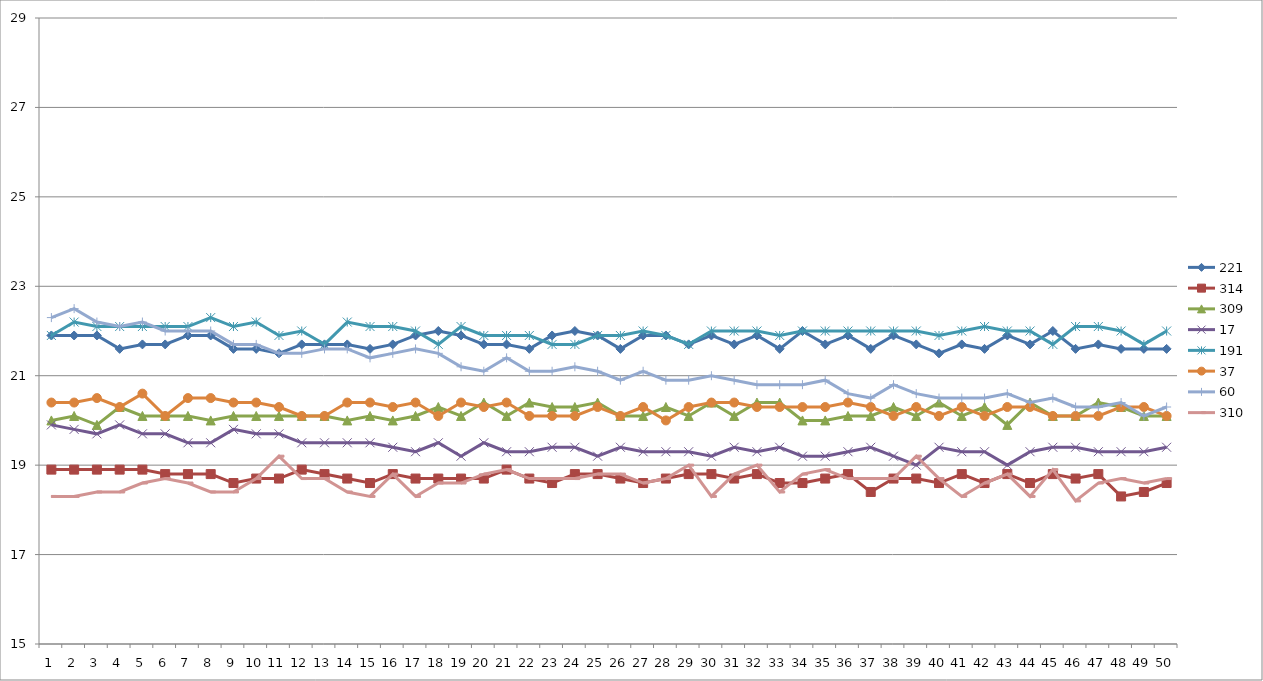
| Category | 221 | 314 | 309 | 17 | 191 | 37 | 60 | 310 |
|---|---|---|---|---|---|---|---|---|
| 0 | 21.9 | 18.9 | 20 | 19.9 | 21.9 | 20.4 | 22.3 | 18.3 |
| 1 | 21.9 | 18.9 | 20.1 | 19.8 | 22.2 | 20.4 | 22.5 | 18.3 |
| 2 | 21.9 | 18.9 | 19.9 | 19.7 | 22.1 | 20.5 | 22.2 | 18.4 |
| 3 | 21.6 | 18.9 | 20.3 | 19.9 | 22.1 | 20.3 | 22.1 | 18.4 |
| 4 | 21.7 | 18.9 | 20.1 | 19.7 | 22.1 | 20.6 | 22.2 | 18.6 |
| 5 | 21.7 | 18.8 | 20.1 | 19.7 | 22.1 | 20.1 | 22 | 18.7 |
| 6 | 21.9 | 18.8 | 20.1 | 19.5 | 22.1 | 20.5 | 22 | 18.6 |
| 7 | 21.9 | 18.8 | 20 | 19.5 | 22.3 | 20.5 | 22 | 18.4 |
| 8 | 21.6 | 18.6 | 20.1 | 19.8 | 22.1 | 20.4 | 21.7 | 18.4 |
| 9 | 21.6 | 18.7 | 20.1 | 19.7 | 22.2 | 20.4 | 21.7 | 18.7 |
| 10 | 21.5 | 18.7 | 20.1 | 19.7 | 21.9 | 20.3 | 21.5 | 19.2 |
| 11 | 21.7 | 18.9 | 20.1 | 19.5 | 22 | 20.1 | 21.5 | 18.7 |
| 12 | 21.7 | 18.8 | 20.1 | 19.5 | 21.7 | 20.1 | 21.6 | 18.7 |
| 13 | 21.7 | 18.7 | 20 | 19.5 | 22.2 | 20.4 | 21.6 | 18.4 |
| 14 | 21.6 | 18.6 | 20.1 | 19.5 | 22.1 | 20.4 | 21.4 | 18.3 |
| 15 | 21.7 | 18.8 | 20 | 19.4 | 22.1 | 20.3 | 21.5 | 18.8 |
| 16 | 21.9 | 18.7 | 20.1 | 19.3 | 22 | 20.4 | 21.6 | 18.3 |
| 17 | 22 | 18.7 | 20.3 | 19.5 | 21.7 | 20.1 | 21.5 | 18.6 |
| 18 | 21.9 | 18.7 | 20.1 | 19.2 | 22.1 | 20.4 | 21.2 | 18.6 |
| 19 | 21.7 | 18.7 | 20.4 | 19.5 | 21.9 | 20.3 | 21.1 | 18.8 |
| 20 | 21.7 | 18.9 | 20.1 | 19.3 | 21.9 | 20.4 | 21.4 | 18.9 |
| 21 | 21.6 | 18.7 | 20.4 | 19.3 | 21.9 | 20.1 | 21.1 | 18.7 |
| 22 | 21.9 | 18.6 | 20.3 | 19.4 | 21.7 | 20.1 | 21.1 | 18.7 |
| 23 | 22 | 18.8 | 20.3 | 19.4 | 21.7 | 20.1 | 21.2 | 18.7 |
| 24 | 21.9 | 18.8 | 20.4 | 19.2 | 21.9 | 20.3 | 21.1 | 18.8 |
| 25 | 21.6 | 18.7 | 20.1 | 19.4 | 21.9 | 20.1 | 20.9 | 18.8 |
| 26 | 21.9 | 18.6 | 20.1 | 19.3 | 22 | 20.3 | 21.1 | 18.6 |
| 27 | 21.9 | 18.7 | 20.3 | 19.3 | 21.9 | 20 | 20.9 | 18.7 |
| 28 | 21.7 | 18.8 | 20.1 | 19.3 | 21.7 | 20.3 | 20.9 | 19 |
| 29 | 21.9 | 18.8 | 20.4 | 19.2 | 22 | 20.4 | 21 | 18.3 |
| 30 | 21.7 | 18.7 | 20.1 | 19.4 | 22 | 20.4 | 20.9 | 18.8 |
| 31 | 21.9 | 18.8 | 20.4 | 19.3 | 22 | 20.3 | 20.8 | 19 |
| 32 | 21.6 | 18.6 | 20.4 | 19.4 | 21.9 | 20.3 | 20.8 | 18.4 |
| 33 | 22 | 18.6 | 20 | 19.2 | 22 | 20.3 | 20.8 | 18.8 |
| 34 | 21.7 | 18.7 | 20 | 19.2 | 22 | 20.3 | 20.9 | 18.9 |
| 35 | 21.9 | 18.8 | 20.1 | 19.3 | 22 | 20.4 | 20.6 | 18.7 |
| 36 | 21.6 | 18.4 | 20.1 | 19.4 | 22 | 20.3 | 20.5 | 18.7 |
| 37 | 21.9 | 18.7 | 20.3 | 19.2 | 22 | 20.1 | 20.8 | 18.7 |
| 38 | 21.7 | 18.7 | 20.1 | 19 | 22 | 20.3 | 20.6 | 19.2 |
| 39 | 21.5 | 18.6 | 20.4 | 19.4 | 21.9 | 20.1 | 20.5 | 18.7 |
| 40 | 21.7 | 18.8 | 20.1 | 19.3 | 22 | 20.3 | 20.5 | 18.3 |
| 41 | 21.6 | 18.6 | 20.3 | 19.3 | 22.1 | 20.1 | 20.5 | 18.6 |
| 42 | 21.9 | 18.8 | 19.9 | 19 | 22 | 20.3 | 20.6 | 18.8 |
| 43 | 21.7 | 18.6 | 20.4 | 19.3 | 22 | 20.3 | 20.4 | 18.3 |
| 44 | 22 | 18.8 | 20.1 | 19.4 | 21.7 | 20.1 | 20.5 | 18.9 |
| 45 | 21.6 | 18.7 | 20.1 | 19.4 | 22.1 | 20.1 | 20.3 | 18.2 |
| 46 | 21.7 | 18.8 | 20.4 | 19.3 | 22.1 | 20.1 | 20.3 | 18.6 |
| 47 | 21.6 | 18.3 | 20.3 | 19.3 | 22 | 20.3 | 20.4 | 18.7 |
| 48 | 21.6 | 18.4 | 20.1 | 19.3 | 21.7 | 20.3 | 20.1 | 18.6 |
| 49 | 21.6 | 18.6 | 20.1 | 19.4 | 22 | 20.1 | 20.3 | 18.7 |